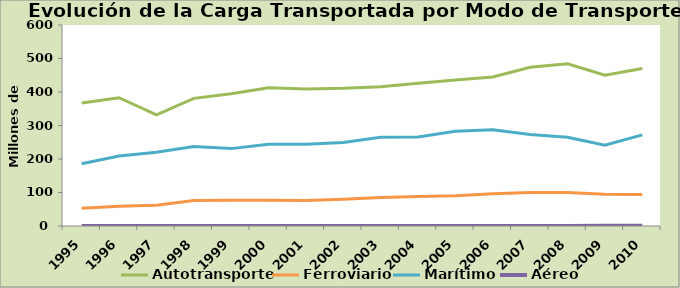
| Category | Autotransporte | Ferroviario | Marítimo | Aéreo |
|---|---|---|---|---|
| 1995.0 | 367 | 53 | 186 | 0 |
| 1996.0 | 383 | 59 | 209 | 0 |
| 1997.0 | 332 | 62 | 220 | 0 |
| 1998.0 | 381 | 76 | 237 | 0 |
| 1999.0 | 395 | 77 | 231 | 0 |
| 2000.0 | 413 | 77 | 244 | 0 |
| 2001.0 | 409 | 76 | 244 | 0 |
| 2002.0 | 411 | 80 | 249 | 0 |
| 2003.0 | 416 | 85 | 265 | 0 |
| 2004.0 | 426 | 88 | 266 | 0 |
| 2005.0 | 436 | 90 | 283 | 0 |
| 2006.0 | 445 | 96 | 287 | 0 |
| 2007.0 | 474 | 100 | 273 | 0 |
| 2008.0 | 484 | 100 | 265 | 0 |
| 2009.0 | 450 | 94.6 | 241 | 0.4 |
| 2010.0 | 470 | 94 | 272 | 0.559 |